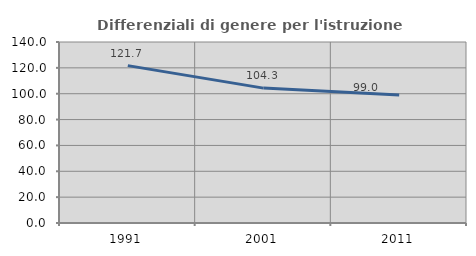
| Category | Differenziali di genere per l'istruzione superiore |
|---|---|
| 1991.0 | 121.723 |
| 2001.0 | 104.328 |
| 2011.0 | 99.03 |